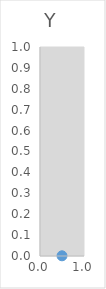
| Category | Series 0 |
|---|---|
| 0.5 | 0.001 |